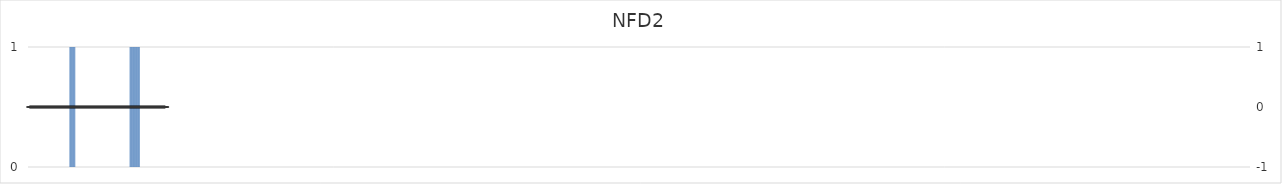
| Category | NFD2 |
|---|---|
| 1.0 | 0 |
| 2.0 | 0 |
| 3.0 | 0 |
| 4.0 | 0 |
| 5.0 | 0 |
| 6.0 | 0 |
| 7.0 | 0 |
| 8.0 | 0 |
| 9.0 | 0 |
| 10.0 | 0 |
| 11.0 | 0 |
| 12.0 | 0 |
| 13.0 | 0 |
| 14.0 | 0 |
| 15.0 | 0 |
| 16.0 | 0 |
| 17.0 | 0 |
| 18.0 | 0 |
| 19.0 | 0 |
| 20.0 | 0 |
| 21.0 | 0 |
| 22.0 | 0 |
| 23.0 | 0 |
| 24.0 | 0 |
| 25.0 | 0 |
| 26.0 | 0 |
| 27.0 | 0 |
| 28.0 | 0 |
| 29.0 | 0 |
| 30.0 | 0 |
| 31.0 | 0 |
| 32.0 | 0 |
| 33.0 | 0 |
| 34.0 | 0 |
| 35.0 | 0 |
| 36.0 | 0 |
| 37.0 | 0 |
| 38.0 | 0 |
| 39.0 | 0 |
| 40.0 | 0 |
| 41.0 | 0 |
| 42.0 | 0 |
| 43.0 | 0 |
| 44.0 | 0 |
| 45.0 | 0 |
| 46.0 | 0 |
| 47.0 | 0 |
| 48.0 | 0 |
| 49.0 | 0 |
| 50.0 | 0 |
| 51.0 | 0 |
| 52.0 | 0 |
| 53.0 | 0 |
| 54.0 | 0 |
| 55.0 | 0 |
| 56.0 | 0 |
| 57.0 | 0 |
| 58.0 | 0 |
| 59.0 | 1 |
| 60.0 | 1 |
| 61.0 | 1 |
| 62.0 | 1 |
| 63.0 | 1 |
| 64.0 | 1 |
| 65.0 | 1 |
| 66.0 | 1 |
| 67.0 | 0 |
| 68.0 | 0 |
| 69.0 | 0 |
| 70.0 | 0 |
| 71.0 | 0 |
| 72.0 | 0 |
| 73.0 | 0 |
| 74.0 | 0 |
| 75.0 | 0 |
| 76.0 | 0 |
| 77.0 | 0 |
| 78.0 | 0 |
| 79.0 | 0 |
| 80.0 | 0 |
| 81.0 | 0 |
| 82.0 | 0 |
| 83.0 | 0 |
| 84.0 | 0 |
| 85.0 | 0 |
| 86.0 | 0 |
| 87.0 | 0 |
| 88.0 | 0 |
| 89.0 | 0 |
| 90.0 | 0 |
| 91.0 | 0 |
| 92.0 | 0 |
| 93.0 | 0 |
| 94.0 | 0 |
| 95.0 | 0 |
| 96.0 | 0 |
| 97.0 | 0 |
| 98.0 | 0 |
| 99.0 | 0 |
| 100.0 | 0 |
| 101.0 | 0 |
| 102.0 | 0 |
| 103.0 | 0 |
| 104.0 | 0 |
| 105.0 | 0 |
| 106.0 | 0 |
| 107.0 | 0 |
| 108.0 | 0 |
| 109.0 | 0 |
| 110.0 | 0 |
| 111.0 | 0 |
| 112.0 | 0 |
| 113.0 | 0 |
| 114.0 | 0 |
| 115.0 | 0 |
| 116.0 | 0 |
| 117.0 | 0 |
| 118.0 | 0 |
| 119.0 | 0 |
| 120.0 | 0 |
| 121.0 | 0 |
| 122.0 | 0 |
| 123.0 | 0 |
| 124.0 | 0 |
| 125.0 | 0 |
| 126.0 | 0 |
| 127.0 | 0 |
| 128.0 | 0 |
| 129.0 | 0 |
| 130.0 | 0 |
| 131.0 | 0 |
| 132.0 | 0 |
| 133.0 | 0 |
| 134.0 | 0 |
| 135.0 | 0 |
| 136.0 | 0 |
| 137.0 | 0 |
| 138.0 | 0 |
| 139.0 | 0 |
| 140.0 | 0 |
| 141.0 | 0 |
| 142.0 | 0 |
| 143.0 | 1 |
| 144.0 | 1 |
| 145.0 | 1 |
| 146.0 | 1 |
| 147.0 | 1 |
| 148.0 | 1 |
| 149.0 | 1 |
| 150.0 | 1 |
| 151.0 | 1 |
| 152.0 | 1 |
| 153.0 | 1 |
| 154.0 | 1 |
| 155.0 | 1 |
| 156.0 | 1 |
| 157.0 | 0 |
| 158.0 | 0 |
| 159.0 | 0 |
| 160.0 | 0 |
| 161.0 | 0 |
| 162.0 | 0 |
| 163.0 | 0 |
| 164.0 | 0 |
| 165.0 | 0 |
| 166.0 | 0 |
| 167.0 | 0 |
| 168.0 | 0 |
| 169.0 | 0 |
| 170.0 | 0 |
| 171.0 | 0 |
| 172.0 | 0 |
| 173.0 | 0 |
| 174.0 | 0 |
| 175.0 | 0 |
| 176.0 | 0 |
| 177.0 | 0 |
| 178.0 | 0 |
| 179.0 | 0 |
| 180.0 | 0 |
| 181.0 | 0 |
| 182.0 | 0 |
| 183.0 | 0 |
| 184.0 | 0 |
| 185.0 | 0 |
| 186.0 | 0 |
| 187.0 | 0 |
| 188.0 | 0 |
| 189.0 | 0 |
| 190.0 | 0 |
| 191.0 | 0 |
| 192.0 | 0 |
| 193.0 | 0 |
| 194.0 | 0 |
| 195.0 | 0 |
| 196.0 | 0 |
| 197.0 | 0 |
| 198.0 | 0 |
| 199.0 | 0 |
| 200.0 | 0 |
| 201.0 | 0 |
| 202.0 | 0 |
| 203.0 | 0 |
| 204.0 | 0 |
| 205.0 | 0 |
| 206.0 | 0 |
| 207.0 | 0 |
| 208.0 | 0 |
| 209.0 | 0 |
| 210.0 | 0 |
| 211.0 | 0 |
| 212.0 | 0 |
| 213.0 | 0 |
| 214.0 | 0 |
| 215.0 | 0 |
| 216.0 | 0 |
| 217.0 | 0 |
| 218.0 | 0 |
| 219.0 | 0 |
| 220.0 | 0 |
| 221.0 | 0 |
| 222.0 | 0 |
| 223.0 | 0 |
| 224.0 | 0 |
| 225.0 | 0 |
| 226.0 | 0 |
| 227.0 | 0 |
| 228.0 | 0 |
| 229.0 | 0 |
| 230.0 | 0 |
| 231.0 | 0 |
| 232.0 | 0 |
| 233.0 | 0 |
| 234.0 | 0 |
| 235.0 | 0 |
| 236.0 | 0 |
| 237.0 | 0 |
| 238.0 | 0 |
| 239.0 | 0 |
| 240.0 | 0 |
| 241.0 | 0 |
| 242.0 | 0 |
| 243.0 | 0 |
| 244.0 | 0 |
| 245.0 | 0 |
| 246.0 | 0 |
| 247.0 | 0 |
| 248.0 | 0 |
| 249.0 | 0 |
| 250.0 | 0 |
| 251.0 | 0 |
| 252.0 | 0 |
| 253.0 | 0 |
| 254.0 | 0 |
| 255.0 | 0 |
| 256.0 | 0 |
| 257.0 | 0 |
| 258.0 | 0 |
| 259.0 | 0 |
| 260.0 | 0 |
| 261.0 | 0 |
| 262.0 | 0 |
| 263.0 | 0 |
| 264.0 | 0 |
| 265.0 | 0 |
| 266.0 | 0 |
| 267.0 | 0 |
| 268.0 | 0 |
| 269.0 | 0 |
| 270.0 | 0 |
| 271.0 | 0 |
| 272.0 | 0 |
| 273.0 | 0 |
| 274.0 | 0 |
| 275.0 | 0 |
| 276.0 | 0 |
| 277.0 | 0 |
| 278.0 | 0 |
| 279.0 | 0 |
| 280.0 | 0 |
| 281.0 | 0 |
| 282.0 | 0 |
| 283.0 | 0 |
| 284.0 | 0 |
| 285.0 | 0 |
| 286.0 | 0 |
| 287.0 | 0 |
| 288.0 | 0 |
| 289.0 | 0 |
| 290.0 | 0 |
| 291.0 | 0 |
| 292.0 | 0 |
| 293.0 | 0 |
| 294.0 | 0 |
| 295.0 | 0 |
| 296.0 | 0 |
| 297.0 | 0 |
| 298.0 | 0 |
| 299.0 | 0 |
| 300.0 | 0 |
| 301.0 | 0 |
| 302.0 | 0 |
| 303.0 | 0 |
| 304.0 | 0 |
| 305.0 | 0 |
| 306.0 | 0 |
| 307.0 | 0 |
| 308.0 | 0 |
| 309.0 | 0 |
| 310.0 | 0 |
| 311.0 | 0 |
| 312.0 | 0 |
| 313.0 | 0 |
| 314.0 | 0 |
| 315.0 | 0 |
| 316.0 | 0 |
| 317.0 | 0 |
| 318.0 | 0 |
| 319.0 | 0 |
| 320.0 | 0 |
| 321.0 | 0 |
| 322.0 | 0 |
| 323.0 | 0 |
| 324.0 | 0 |
| 325.0 | 0 |
| 326.0 | 0 |
| 327.0 | 0 |
| 328.0 | 0 |
| 329.0 | 0 |
| 330.0 | 0 |
| 331.0 | 0 |
| 332.0 | 0 |
| 333.0 | 0 |
| 334.0 | 0 |
| 335.0 | 0 |
| 336.0 | 0 |
| 337.0 | 0 |
| 338.0 | 0 |
| 339.0 | 0 |
| 340.0 | 0 |
| 341.0 | 0 |
| 342.0 | 0 |
| 343.0 | 0 |
| 344.0 | 0 |
| 345.0 | 0 |
| 346.0 | 0 |
| 347.0 | 0 |
| 348.0 | 0 |
| 349.0 | 0 |
| 350.0 | 0 |
| 351.0 | 0 |
| 352.0 | 0 |
| 353.0 | 0 |
| 354.0 | 0 |
| 355.0 | 0 |
| 356.0 | 0 |
| 357.0 | 0 |
| 358.0 | 0 |
| 359.0 | 0 |
| 360.0 | 0 |
| 361.0 | 0 |
| 362.0 | 0 |
| 363.0 | 0 |
| 364.0 | 0 |
| 365.0 | 0 |
| 366.0 | 0 |
| 367.0 | 0 |
| 368.0 | 0 |
| 369.0 | 0 |
| 370.0 | 0 |
| 371.0 | 0 |
| 372.0 | 0 |
| 373.0 | 0 |
| 374.0 | 0 |
| 375.0 | 0 |
| 376.0 | 0 |
| 377.0 | 0 |
| 378.0 | 0 |
| 379.0 | 0 |
| 380.0 | 0 |
| 381.0 | 0 |
| 382.0 | 0 |
| 383.0 | 0 |
| 384.0 | 0 |
| 385.0 | 0 |
| 386.0 | 0 |
| 387.0 | 0 |
| 388.0 | 0 |
| 389.0 | 0 |
| 390.0 | 0 |
| 391.0 | 0 |
| 392.0 | 0 |
| 393.0 | 0 |
| 394.0 | 0 |
| 395.0 | 0 |
| 396.0 | 0 |
| 397.0 | 0 |
| 398.0 | 0 |
| 399.0 | 0 |
| 400.0 | 0 |
| 401.0 | 0 |
| 402.0 | 0 |
| 403.0 | 0 |
| 404.0 | 0 |
| 405.0 | 0 |
| 406.0 | 0 |
| 407.0 | 0 |
| 408.0 | 0 |
| 409.0 | 0 |
| 410.0 | 0 |
| 411.0 | 0 |
| 412.0 | 0 |
| 413.0 | 0 |
| 414.0 | 0 |
| 415.0 | 0 |
| 416.0 | 0 |
| 417.0 | 0 |
| 418.0 | 0 |
| 419.0 | 0 |
| 420.0 | 0 |
| 421.0 | 0 |
| 422.0 | 0 |
| 423.0 | 0 |
| 424.0 | 0 |
| 425.0 | 0 |
| 426.0 | 0 |
| 427.0 | 0 |
| 428.0 | 0 |
| 429.0 | 0 |
| 430.0 | 0 |
| 431.0 | 0 |
| 432.0 | 0 |
| 433.0 | 0 |
| 434.0 | 0 |
| 435.0 | 0 |
| 436.0 | 0 |
| 437.0 | 0 |
| 438.0 | 0 |
| 439.0 | 0 |
| 440.0 | 0 |
| 441.0 | 0 |
| 442.0 | 0 |
| 443.0 | 0 |
| 444.0 | 0 |
| 445.0 | 0 |
| 446.0 | 0 |
| 447.0 | 0 |
| 448.0 | 0 |
| 449.0 | 0 |
| 450.0 | 0 |
| 451.0 | 0 |
| 452.0 | 0 |
| 453.0 | 0 |
| 454.0 | 0 |
| 455.0 | 0 |
| 456.0 | 0 |
| 457.0 | 0 |
| 458.0 | 0 |
| 459.0 | 0 |
| 460.0 | 0 |
| 461.0 | 0 |
| 462.0 | 0 |
| 463.0 | 0 |
| 464.0 | 0 |
| 465.0 | 0 |
| 466.0 | 0 |
| 467.0 | 0 |
| 468.0 | 0 |
| 469.0 | 0 |
| 470.0 | 0 |
| 471.0 | 0 |
| 472.0 | 0 |
| 473.0 | 0 |
| 474.0 | 0 |
| 475.0 | 0 |
| 476.0 | 0 |
| 477.0 | 0 |
| 478.0 | 0 |
| 479.0 | 0 |
| 480.0 | 0 |
| 481.0 | 0 |
| 482.0 | 0 |
| 483.0 | 0 |
| 484.0 | 0 |
| 485.0 | 0 |
| 486.0 | 0 |
| 487.0 | 0 |
| 488.0 | 0 |
| 489.0 | 0 |
| 490.0 | 0 |
| 491.0 | 0 |
| 492.0 | 0 |
| 493.0 | 0 |
| 494.0 | 0 |
| 495.0 | 0 |
| 496.0 | 0 |
| 497.0 | 0 |
| 498.0 | 0 |
| 499.0 | 0 |
| 500.0 | 0 |
| 501.0 | 0 |
| 502.0 | 0 |
| 503.0 | 0 |
| 504.0 | 0 |
| 505.0 | 0 |
| 506.0 | 0 |
| 507.0 | 0 |
| 508.0 | 0 |
| 509.0 | 0 |
| 510.0 | 0 |
| 511.0 | 0 |
| 512.0 | 0 |
| 513.0 | 0 |
| 514.0 | 0 |
| 515.0 | 0 |
| 516.0 | 0 |
| 517.0 | 0 |
| 518.0 | 0 |
| 519.0 | 0 |
| 520.0 | 0 |
| 521.0 | 0 |
| 522.0 | 0 |
| 523.0 | 0 |
| 524.0 | 0 |
| 525.0 | 0 |
| 526.0 | 0 |
| 527.0 | 0 |
| 528.0 | 0 |
| 529.0 | 0 |
| 530.0 | 0 |
| 531.0 | 0 |
| 532.0 | 0 |
| 533.0 | 0 |
| 534.0 | 0 |
| 535.0 | 0 |
| 536.0 | 0 |
| 537.0 | 0 |
| 538.0 | 0 |
| 539.0 | 0 |
| 540.0 | 0 |
| 541.0 | 0 |
| 542.0 | 0 |
| 543.0 | 0 |
| 544.0 | 0 |
| 545.0 | 0 |
| 546.0 | 0 |
| 547.0 | 0 |
| 548.0 | 0 |
| 549.0 | 0 |
| 550.0 | 0 |
| 551.0 | 0 |
| 552.0 | 0 |
| 553.0 | 0 |
| 554.0 | 0 |
| 555.0 | 0 |
| 556.0 | 0 |
| 557.0 | 0 |
| 558.0 | 0 |
| 559.0 | 0 |
| 560.0 | 0 |
| 561.0 | 0 |
| 562.0 | 0 |
| 563.0 | 0 |
| 564.0 | 0 |
| 565.0 | 0 |
| 566.0 | 0 |
| 567.0 | 0 |
| 568.0 | 0 |
| 569.0 | 0 |
| 570.0 | 0 |
| 571.0 | 0 |
| 572.0 | 0 |
| 573.0 | 0 |
| 574.0 | 0 |
| 575.0 | 0 |
| 576.0 | 0 |
| 577.0 | 0 |
| 578.0 | 0 |
| 579.0 | 0 |
| 580.0 | 0 |
| 581.0 | 0 |
| 582.0 | 0 |
| 583.0 | 0 |
| 584.0 | 0 |
| 585.0 | 0 |
| 586.0 | 0 |
| 587.0 | 0 |
| 588.0 | 0 |
| 589.0 | 0 |
| 590.0 | 0 |
| 591.0 | 0 |
| 592.0 | 0 |
| 593.0 | 0 |
| 594.0 | 0 |
| 595.0 | 0 |
| 596.0 | 0 |
| 597.0 | 0 |
| 598.0 | 0 |
| 599.0 | 0 |
| 600.0 | 0 |
| 601.0 | 0 |
| 602.0 | 0 |
| 603.0 | 0 |
| 604.0 | 0 |
| 605.0 | 0 |
| 606.0 | 0 |
| 607.0 | 0 |
| 608.0 | 0 |
| 609.0 | 0 |
| 610.0 | 0 |
| 611.0 | 0 |
| 612.0 | 0 |
| 613.0 | 0 |
| 614.0 | 0 |
| 615.0 | 0 |
| 616.0 | 0 |
| 617.0 | 0 |
| 618.0 | 0 |
| 619.0 | 0 |
| 620.0 | 0 |
| 621.0 | 0 |
| 622.0 | 0 |
| 623.0 | 0 |
| 624.0 | 0 |
| 625.0 | 0 |
| 626.0 | 0 |
| 627.0 | 0 |
| 628.0 | 0 |
| 629.0 | 0 |
| 630.0 | 0 |
| 631.0 | 0 |
| 632.0 | 0 |
| 633.0 | 0 |
| 634.0 | 0 |
| 635.0 | 0 |
| 636.0 | 0 |
| 637.0 | 0 |
| 638.0 | 0 |
| 639.0 | 0 |
| 640.0 | 0 |
| 641.0 | 0 |
| 642.0 | 0 |
| 643.0 | 0 |
| 644.0 | 0 |
| 645.0 | 0 |
| 646.0 | 0 |
| 647.0 | 0 |
| 648.0 | 0 |
| 649.0 | 0 |
| 650.0 | 0 |
| 651.0 | 0 |
| 652.0 | 0 |
| 653.0 | 0 |
| 654.0 | 0 |
| 655.0 | 0 |
| 656.0 | 0 |
| 657.0 | 0 |
| 658.0 | 0 |
| 659.0 | 0 |
| 660.0 | 0 |
| 661.0 | 0 |
| 662.0 | 0 |
| 663.0 | 0 |
| 664.0 | 0 |
| 665.0 | 0 |
| 666.0 | 0 |
| 667.0 | 0 |
| 668.0 | 0 |
| 669.0 | 0 |
| 670.0 | 0 |
| 671.0 | 0 |
| 672.0 | 0 |
| 673.0 | 0 |
| 674.0 | 0 |
| 675.0 | 0 |
| 676.0 | 0 |
| 677.0 | 0 |
| 678.0 | 0 |
| 679.0 | 0 |
| 680.0 | 0 |
| 681.0 | 0 |
| 682.0 | 0 |
| 683.0 | 0 |
| 684.0 | 0 |
| 685.0 | 0 |
| 686.0 | 0 |
| 687.0 | 0 |
| 688.0 | 0 |
| 689.0 | 0 |
| 690.0 | 0 |
| 691.0 | 0 |
| 692.0 | 0 |
| 693.0 | 0 |
| 694.0 | 0 |
| 695.0 | 0 |
| 696.0 | 0 |
| 697.0 | 0 |
| 698.0 | 0 |
| 699.0 | 0 |
| 700.0 | 0 |
| 701.0 | 0 |
| 702.0 | 0 |
| 703.0 | 0 |
| 704.0 | 0 |
| 705.0 | 0 |
| 706.0 | 0 |
| 707.0 | 0 |
| 708.0 | 0 |
| 709.0 | 0 |
| 710.0 | 0 |
| 711.0 | 0 |
| 712.0 | 0 |
| 713.0 | 0 |
| 714.0 | 0 |
| 715.0 | 0 |
| 716.0 | 0 |
| 717.0 | 0 |
| 718.0 | 0 |
| 719.0 | 0 |
| 720.0 | 0 |
| 721.0 | 0 |
| 722.0 | 0 |
| 723.0 | 0 |
| 724.0 | 0 |
| 725.0 | 0 |
| 726.0 | 0 |
| 727.0 | 0 |
| 728.0 | 0 |
| 729.0 | 0 |
| 730.0 | 0 |
| 731.0 | 0 |
| 732.0 | 0 |
| 733.0 | 0 |
| 734.0 | 0 |
| 735.0 | 0 |
| 736.0 | 0 |
| 737.0 | 0 |
| 738.0 | 0 |
| 739.0 | 0 |
| 740.0 | 0 |
| 741.0 | 0 |
| 742.0 | 0 |
| 743.0 | 0 |
| 744.0 | 0 |
| 745.0 | 0 |
| 746.0 | 0 |
| 747.0 | 0 |
| 748.0 | 0 |
| 749.0 | 0 |
| 750.0 | 0 |
| 751.0 | 0 |
| 752.0 | 0 |
| 753.0 | 0 |
| 754.0 | 0 |
| 755.0 | 0 |
| 756.0 | 0 |
| 757.0 | 0 |
| 758.0 | 0 |
| 759.0 | 0 |
| 760.0 | 0 |
| 761.0 | 0 |
| 762.0 | 0 |
| 763.0 | 0 |
| 764.0 | 0 |
| 765.0 | 0 |
| 766.0 | 0 |
| 767.0 | 0 |
| 768.0 | 0 |
| 769.0 | 0 |
| 770.0 | 0 |
| 771.0 | 0 |
| 772.0 | 0 |
| 773.0 | 0 |
| 774.0 | 0 |
| 775.0 | 0 |
| 776.0 | 0 |
| 777.0 | 0 |
| 778.0 | 0 |
| 779.0 | 0 |
| 780.0 | 0 |
| 781.0 | 0 |
| 782.0 | 0 |
| 783.0 | 0 |
| 784.0 | 0 |
| 785.0 | 0 |
| 786.0 | 0 |
| 787.0 | 0 |
| 788.0 | 0 |
| 789.0 | 0 |
| 790.0 | 0 |
| 791.0 | 0 |
| 792.0 | 0 |
| 793.0 | 0 |
| 794.0 | 0 |
| 795.0 | 0 |
| 796.0 | 0 |
| 797.0 | 0 |
| 798.0 | 0 |
| 799.0 | 0 |
| 800.0 | 0 |
| 801.0 | 0 |
| 802.0 | 0 |
| 803.0 | 0 |
| 804.0 | 0 |
| 805.0 | 0 |
| 806.0 | 0 |
| 807.0 | 0 |
| 808.0 | 0 |
| 809.0 | 0 |
| 810.0 | 0 |
| 811.0 | 0 |
| 812.0 | 0 |
| 813.0 | 0 |
| 814.0 | 0 |
| 815.0 | 0 |
| 816.0 | 0 |
| 817.0 | 0 |
| 818.0 | 0 |
| 819.0 | 0 |
| 820.0 | 0 |
| 821.0 | 0 |
| 822.0 | 0 |
| 823.0 | 0 |
| 824.0 | 0 |
| 825.0 | 0 |
| 826.0 | 0 |
| 827.0 | 0 |
| 828.0 | 0 |
| 829.0 | 0 |
| 830.0 | 0 |
| 831.0 | 0 |
| 832.0 | 0 |
| 833.0 | 0 |
| 834.0 | 0 |
| 835.0 | 0 |
| 836.0 | 0 |
| 837.0 | 0 |
| 838.0 | 0 |
| 839.0 | 0 |
| 840.0 | 0 |
| 841.0 | 0 |
| 842.0 | 0 |
| 843.0 | 0 |
| 844.0 | 0 |
| 845.0 | 0 |
| 846.0 | 0 |
| 847.0 | 0 |
| 848.0 | 0 |
| 849.0 | 0 |
| 850.0 | 0 |
| 851.0 | 0 |
| 852.0 | 0 |
| 853.0 | 0 |
| 854.0 | 0 |
| 855.0 | 0 |
| 856.0 | 0 |
| 857.0 | 0 |
| 858.0 | 0 |
| 859.0 | 0 |
| 860.0 | 0 |
| 861.0 | 0 |
| 862.0 | 0 |
| 863.0 | 0 |
| 864.0 | 0 |
| 865.0 | 0 |
| 866.0 | 0 |
| 867.0 | 0 |
| 868.0 | 0 |
| 869.0 | 0 |
| 870.0 | 0 |
| 871.0 | 0 |
| 872.0 | 0 |
| 873.0 | 0 |
| 874.0 | 0 |
| 875.0 | 0 |
| 876.0 | 0 |
| 877.0 | 0 |
| 878.0 | 0 |
| 879.0 | 0 |
| 880.0 | 0 |
| 881.0 | 0 |
| 882.0 | 0 |
| 883.0 | 0 |
| 884.0 | 0 |
| 885.0 | 0 |
| 886.0 | 0 |
| 887.0 | 0 |
| 888.0 | 0 |
| 889.0 | 0 |
| 890.0 | 0 |
| 891.0 | 0 |
| 892.0 | 0 |
| 893.0 | 0 |
| 894.0 | 0 |
| 895.0 | 0 |
| 896.0 | 0 |
| 897.0 | 0 |
| 898.0 | 0 |
| 899.0 | 0 |
| 900.0 | 0 |
| 901.0 | 0 |
| 902.0 | 0 |
| 903.0 | 0 |
| 904.0 | 0 |
| 905.0 | 0 |
| 906.0 | 0 |
| 907.0 | 0 |
| 908.0 | 0 |
| 909.0 | 0 |
| 910.0 | 0 |
| 911.0 | 0 |
| 912.0 | 0 |
| 913.0 | 0 |
| 914.0 | 0 |
| 915.0 | 0 |
| 916.0 | 0 |
| 917.0 | 0 |
| 918.0 | 0 |
| 919.0 | 0 |
| 920.0 | 0 |
| 921.0 | 0 |
| 922.0 | 0 |
| 923.0 | 0 |
| 924.0 | 0 |
| 925.0 | 0 |
| 926.0 | 0 |
| 927.0 | 0 |
| 928.0 | 0 |
| 929.0 | 0 |
| 930.0 | 0 |
| 931.0 | 0 |
| 932.0 | 0 |
| 933.0 | 0 |
| 934.0 | 0 |
| 935.0 | 0 |
| 936.0 | 0 |
| 937.0 | 0 |
| 938.0 | 0 |
| 939.0 | 0 |
| 940.0 | 0 |
| 941.0 | 0 |
| 942.0 | 0 |
| 943.0 | 0 |
| 944.0 | 0 |
| 945.0 | 0 |
| 946.0 | 0 |
| 947.0 | 0 |
| 948.0 | 0 |
| 949.0 | 0 |
| 950.0 | 0 |
| 951.0 | 0 |
| 952.0 | 0 |
| 953.0 | 0 |
| 954.0 | 0 |
| 955.0 | 0 |
| 956.0 | 0 |
| 957.0 | 0 |
| 958.0 | 0 |
| 959.0 | 0 |
| 960.0 | 0 |
| 961.0 | 0 |
| 962.0 | 0 |
| 963.0 | 0 |
| 964.0 | 0 |
| 965.0 | 0 |
| 966.0 | 0 |
| 967.0 | 0 |
| 968.0 | 0 |
| 969.0 | 0 |
| 970.0 | 0 |
| 971.0 | 0 |
| 972.0 | 0 |
| 973.0 | 0 |
| 974.0 | 0 |
| 975.0 | 0 |
| 976.0 | 0 |
| 977.0 | 0 |
| 978.0 | 0 |
| 979.0 | 0 |
| 980.0 | 0 |
| 981.0 | 0 |
| 982.0 | 0 |
| 983.0 | 0 |
| 984.0 | 0 |
| 985.0 | 0 |
| 986.0 | 0 |
| 987.0 | 0 |
| 988.0 | 0 |
| 989.0 | 0 |
| 990.0 | 0 |
| 991.0 | 0 |
| 992.0 | 0 |
| 993.0 | 0 |
| 994.0 | 0 |
| 995.0 | 0 |
| 996.0 | 0 |
| 997.0 | 0 |
| 998.0 | 0 |
| 999.0 | 0 |
| 1000.0 | 0 |
| 1001.0 | 0 |
| 1002.0 | 0 |
| 1003.0 | 0 |
| 1004.0 | 0 |
| 1005.0 | 0 |
| 1006.0 | 0 |
| 1007.0 | 0 |
| 1008.0 | 0 |
| 1009.0 | 0 |
| 1010.0 | 0 |
| 1011.0 | 0 |
| 1012.0 | 0 |
| 1013.0 | 0 |
| 1014.0 | 0 |
| 1015.0 | 0 |
| 1016.0 | 0 |
| 1017.0 | 0 |
| 1018.0 | 0 |
| 1019.0 | 0 |
| 1020.0 | 0 |
| 1021.0 | 0 |
| 1022.0 | 0 |
| 1023.0 | 0 |
| 1024.0 | 0 |
| 1025.0 | 0 |
| 1026.0 | 0 |
| 1027.0 | 0 |
| 1028.0 | 0 |
| 1029.0 | 0 |
| 1030.0 | 0 |
| 1031.0 | 0 |
| 1032.0 | 0 |
| 1033.0 | 0 |
| 1034.0 | 0 |
| 1035.0 | 0 |
| 1036.0 | 0 |
| 1037.0 | 0 |
| 1038.0 | 0 |
| 1039.0 | 0 |
| 1040.0 | 0 |
| 1041.0 | 0 |
| 1042.0 | 0 |
| 1043.0 | 0 |
| 1044.0 | 0 |
| 1045.0 | 0 |
| 1046.0 | 0 |
| 1047.0 | 0 |
| 1048.0 | 0 |
| 1049.0 | 0 |
| 1050.0 | 0 |
| 1051.0 | 0 |
| 1052.0 | 0 |
| 1053.0 | 0 |
| 1054.0 | 0 |
| 1055.0 | 0 |
| 1056.0 | 0 |
| 1057.0 | 0 |
| 1058.0 | 0 |
| 1059.0 | 0 |
| 1060.0 | 0 |
| 1061.0 | 0 |
| 1062.0 | 0 |
| 1063.0 | 0 |
| 1064.0 | 0 |
| 1065.0 | 0 |
| 1066.0 | 0 |
| 1067.0 | 0 |
| 1068.0 | 0 |
| 1069.0 | 0 |
| 1070.0 | 0 |
| 1071.0 | 0 |
| 1072.0 | 0 |
| 1073.0 | 0 |
| 1074.0 | 0 |
| 1075.0 | 0 |
| 1076.0 | 0 |
| 1077.0 | 0 |
| 1078.0 | 0 |
| 1079.0 | 0 |
| 1080.0 | 0 |
| 1081.0 | 0 |
| 1082.0 | 0 |
| 1083.0 | 0 |
| 1084.0 | 0 |
| 1085.0 | 0 |
| 1086.0 | 0 |
| 1087.0 | 0 |
| 1088.0 | 0 |
| 1089.0 | 0 |
| 1090.0 | 0 |
| 1091.0 | 0 |
| 1092.0 | 0 |
| 1093.0 | 0 |
| 1094.0 | 0 |
| 1095.0 | 0 |
| 1096.0 | 0 |
| 1097.0 | 0 |
| 1098.0 | 0 |
| 1099.0 | 0 |
| 1100.0 | 0 |
| 1101.0 | 0 |
| 1102.0 | 0 |
| 1103.0 | 0 |
| 1104.0 | 0 |
| 1105.0 | 0 |
| 1106.0 | 0 |
| 1107.0 | 0 |
| 1108.0 | 0 |
| 1109.0 | 0 |
| 1110.0 | 0 |
| 1111.0 | 0 |
| 1112.0 | 0 |
| 1113.0 | 0 |
| 1114.0 | 0 |
| 1115.0 | 0 |
| 1116.0 | 0 |
| 1117.0 | 0 |
| 1118.0 | 0 |
| 1119.0 | 0 |
| 1120.0 | 0 |
| 1121.0 | 0 |
| 1122.0 | 0 |
| 1123.0 | 0 |
| 1124.0 | 0 |
| 1125.0 | 0 |
| 1126.0 | 0 |
| 1127.0 | 0 |
| 1128.0 | 0 |
| 1129.0 | 0 |
| 1130.0 | 0 |
| 1131.0 | 0 |
| 1132.0 | 0 |
| 1133.0 | 0 |
| 1134.0 | 0 |
| 1135.0 | 0 |
| 1136.0 | 0 |
| 1137.0 | 0 |
| 1138.0 | 0 |
| 1139.0 | 0 |
| 1140.0 | 0 |
| 1141.0 | 0 |
| 1142.0 | 0 |
| 1143.0 | 0 |
| 1144.0 | 0 |
| 1145.0 | 0 |
| 1146.0 | 0 |
| 1147.0 | 0 |
| 1148.0 | 0 |
| 1149.0 | 0 |
| 1150.0 | 0 |
| 1151.0 | 0 |
| 1152.0 | 0 |
| 1153.0 | 0 |
| 1154.0 | 0 |
| 1155.0 | 0 |
| 1156.0 | 0 |
| 1157.0 | 0 |
| 1158.0 | 0 |
| 1159.0 | 0 |
| 1160.0 | 0 |
| 1161.0 | 0 |
| 1162.0 | 0 |
| 1163.0 | 0 |
| 1164.0 | 0 |
| 1165.0 | 0 |
| 1166.0 | 0 |
| 1167.0 | 0 |
| 1168.0 | 0 |
| 1169.0 | 0 |
| 1170.0 | 0 |
| 1171.0 | 0 |
| 1172.0 | 0 |
| 1173.0 | 0 |
| 1174.0 | 0 |
| 1175.0 | 0 |
| 1176.0 | 0 |
| 1177.0 | 0 |
| 1178.0 | 0 |
| 1179.0 | 0 |
| 1180.0 | 0 |
| 1181.0 | 0 |
| 1182.0 | 0 |
| 1183.0 | 0 |
| 1184.0 | 0 |
| 1185.0 | 0 |
| 1186.0 | 0 |
| 1187.0 | 0 |
| 1188.0 | 0 |
| 1189.0 | 0 |
| 1190.0 | 0 |
| 1191.0 | 0 |
| 1192.0 | 0 |
| 1193.0 | 0 |
| 1194.0 | 0 |
| 1195.0 | 0 |
| 1196.0 | 0 |
| 1197.0 | 0 |
| 1198.0 | 0 |
| 1199.0 | 0 |
| 1200.0 | 0 |
| 1201.0 | 0 |
| 1202.0 | 0 |
| 1203.0 | 0 |
| 1204.0 | 0 |
| 1205.0 | 0 |
| 1206.0 | 0 |
| 1207.0 | 0 |
| 1208.0 | 0 |
| 1209.0 | 0 |
| 1210.0 | 0 |
| 1211.0 | 0 |
| 1212.0 | 0 |
| 1213.0 | 0 |
| 1214.0 | 0 |
| 1215.0 | 0 |
| 1216.0 | 0 |
| 1217.0 | 0 |
| 1218.0 | 0 |
| 1219.0 | 0 |
| 1220.0 | 0 |
| 1221.0 | 0 |
| 1222.0 | 0 |
| 1223.0 | 0 |
| 1224.0 | 0 |
| 1225.0 | 0 |
| 1226.0 | 0 |
| 1227.0 | 0 |
| 1228.0 | 0 |
| 1229.0 | 0 |
| 1230.0 | 0 |
| 1231.0 | 0 |
| 1232.0 | 0 |
| 1233.0 | 0 |
| 1234.0 | 0 |
| 1235.0 | 0 |
| 1236.0 | 0 |
| 1237.0 | 0 |
| 1238.0 | 0 |
| 1239.0 | 0 |
| 1240.0 | 0 |
| 1241.0 | 0 |
| 1242.0 | 0 |
| 1243.0 | 0 |
| 1244.0 | 0 |
| 1245.0 | 0 |
| 1246.0 | 0 |
| 1247.0 | 0 |
| 1248.0 | 0 |
| 1249.0 | 0 |
| 1250.0 | 0 |
| 1251.0 | 0 |
| 1252.0 | 0 |
| 1253.0 | 0 |
| 1254.0 | 0 |
| 1255.0 | 0 |
| 1256.0 | 0 |
| 1257.0 | 0 |
| 1258.0 | 0 |
| 1259.0 | 0 |
| 1260.0 | 0 |
| 1261.0 | 0 |
| 1262.0 | 0 |
| 1263.0 | 0 |
| 1264.0 | 0 |
| 1265.0 | 0 |
| 1266.0 | 0 |
| 1267.0 | 0 |
| 1268.0 | 0 |
| 1269.0 | 0 |
| 1270.0 | 0 |
| 1271.0 | 0 |
| 1272.0 | 0 |
| 1273.0 | 0 |
| 1274.0 | 0 |
| 1275.0 | 0 |
| 1276.0 | 0 |
| 1277.0 | 0 |
| 1278.0 | 0 |
| 1279.0 | 0 |
| 1280.0 | 0 |
| 1281.0 | 0 |
| 1282.0 | 0 |
| 1283.0 | 0 |
| 1284.0 | 0 |
| 1285.0 | 0 |
| 1286.0 | 0 |
| 1287.0 | 0 |
| 1288.0 | 0 |
| 1289.0 | 0 |
| 1290.0 | 0 |
| 1291.0 | 0 |
| 1292.0 | 0 |
| 1293.0 | 0 |
| 1294.0 | 0 |
| 1295.0 | 0 |
| 1296.0 | 0 |
| 1297.0 | 0 |
| 1298.0 | 0 |
| 1299.0 | 0 |
| 1300.0 | 0 |
| 1301.0 | 0 |
| 1302.0 | 0 |
| 1303.0 | 0 |
| 1304.0 | 0 |
| 1305.0 | 0 |
| 1306.0 | 0 |
| 1307.0 | 0 |
| 1308.0 | 0 |
| 1309.0 | 0 |
| 1310.0 | 0 |
| 1311.0 | 0 |
| 1312.0 | 0 |
| 1313.0 | 0 |
| 1314.0 | 0 |
| 1315.0 | 0 |
| 1316.0 | 0 |
| 1317.0 | 0 |
| 1318.0 | 0 |
| 1319.0 | 0 |
| 1320.0 | 0 |
| 1321.0 | 0 |
| 1322.0 | 0 |
| 1323.0 | 0 |
| 1324.0 | 0 |
| 1325.0 | 0 |
| 1326.0 | 0 |
| 1327.0 | 0 |
| 1328.0 | 0 |
| 1329.0 | 0 |
| 1330.0 | 0 |
| 1331.0 | 0 |
| 1332.0 | 0 |
| 1333.0 | 0 |
| 1334.0 | 0 |
| 1335.0 | 0 |
| 1336.0 | 0 |
| 1337.0 | 0 |
| 1338.0 | 0 |
| 1339.0 | 0 |
| 1340.0 | 0 |
| 1341.0 | 0 |
| 1342.0 | 0 |
| 1343.0 | 0 |
| 1344.0 | 0 |
| 1345.0 | 0 |
| 1346.0 | 0 |
| 1347.0 | 0 |
| 1348.0 | 0 |
| 1349.0 | 0 |
| 1350.0 | 0 |
| 1351.0 | 0 |
| 1352.0 | 0 |
| 1353.0 | 0 |
| 1354.0 | 0 |
| 1355.0 | 0 |
| 1356.0 | 0 |
| 1357.0 | 0 |
| 1358.0 | 0 |
| 1359.0 | 0 |
| 1360.0 | 0 |
| 1361.0 | 0 |
| 1362.0 | 0 |
| 1363.0 | 0 |
| 1364.0 | 0 |
| 1365.0 | 0 |
| 1366.0 | 0 |
| 1367.0 | 0 |
| 1368.0 | 0 |
| 1369.0 | 0 |
| 1370.0 | 0 |
| 1371.0 | 0 |
| 1372.0 | 0 |
| 1373.0 | 0 |
| 1374.0 | 0 |
| 1375.0 | 0 |
| 1376.0 | 0 |
| 1377.0 | 0 |
| 1378.0 | 0 |
| 1379.0 | 0 |
| 1380.0 | 0 |
| 1381.0 | 0 |
| 1382.0 | 0 |
| 1383.0 | 0 |
| 1384.0 | 0 |
| 1385.0 | 0 |
| 1386.0 | 0 |
| 1387.0 | 0 |
| 1388.0 | 0 |
| 1389.0 | 0 |
| 1390.0 | 0 |
| 1391.0 | 0 |
| 1392.0 | 0 |
| 1393.0 | 0 |
| 1394.0 | 0 |
| 1395.0 | 0 |
| 1396.0 | 0 |
| 1397.0 | 0 |
| 1398.0 | 0 |
| 1399.0 | 0 |
| 1400.0 | 0 |
| 1401.0 | 0 |
| 1402.0 | 0 |
| 1403.0 | 0 |
| 1404.0 | 0 |
| 1405.0 | 0 |
| 1406.0 | 0 |
| 1407.0 | 0 |
| 1408.0 | 0 |
| 1409.0 | 0 |
| 1410.0 | 0 |
| 1411.0 | 0 |
| 1412.0 | 0 |
| 1413.0 | 0 |
| 1414.0 | 0 |
| 1415.0 | 0 |
| 1416.0 | 0 |
| 1417.0 | 0 |
| 1418.0 | 0 |
| 1419.0 | 0 |
| 1420.0 | 0 |
| 1421.0 | 0 |
| 1422.0 | 0 |
| 1423.0 | 0 |
| 1424.0 | 0 |
| 1425.0 | 0 |
| 1426.0 | 0 |
| 1427.0 | 0 |
| 1428.0 | 0 |
| 1429.0 | 0 |
| 1430.0 | 0 |
| 1431.0 | 0 |
| 1432.0 | 0 |
| 1433.0 | 0 |
| 1434.0 | 0 |
| 1435.0 | 0 |
| 1436.0 | 0 |
| 1437.0 | 0 |
| 1438.0 | 0 |
| 1439.0 | 0 |
| 1440.0 | 0 |
| 1441.0 | 0 |
| 1442.0 | 0 |
| 1443.0 | 0 |
| 1444.0 | 0 |
| 1445.0 | 0 |
| 1446.0 | 0 |
| 1447.0 | 0 |
| 1448.0 | 0 |
| 1449.0 | 0 |
| 1450.0 | 0 |
| 1451.0 | 0 |
| 1452.0 | 0 |
| 1453.0 | 0 |
| 1454.0 | 0 |
| 1455.0 | 0 |
| 1456.0 | 0 |
| 1457.0 | 0 |
| 1458.0 | 0 |
| 1459.0 | 0 |
| 1460.0 | 0 |
| 1461.0 | 0 |
| 1462.0 | 0 |
| 1463.0 | 0 |
| 1464.0 | 0 |
| 1465.0 | 0 |
| 1466.0 | 0 |
| 1467.0 | 0 |
| 1468.0 | 0 |
| 1469.0 | 0 |
| 1470.0 | 0 |
| 1471.0 | 0 |
| 1472.0 | 0 |
| 1473.0 | 0 |
| 1474.0 | 0 |
| 1475.0 | 0 |
| 1476.0 | 0 |
| 1477.0 | 0 |
| 1478.0 | 0 |
| 1479.0 | 0 |
| 1480.0 | 0 |
| 1481.0 | 0 |
| 1482.0 | 0 |
| 1483.0 | 0 |
| 1484.0 | 0 |
| 1485.0 | 0 |
| 1486.0 | 0 |
| 1487.0 | 0 |
| 1488.0 | 0 |
| 1489.0 | 0 |
| 1490.0 | 0 |
| 1491.0 | 0 |
| 1492.0 | 0 |
| 1493.0 | 0 |
| 1494.0 | 0 |
| 1495.0 | 0 |
| 1496.0 | 0 |
| 1497.0 | 0 |
| 1498.0 | 0 |
| 1499.0 | 0 |
| 1500.0 | 0 |
| 1501.0 | 0 |
| 1502.0 | 0 |
| 1503.0 | 0 |
| 1504.0 | 0 |
| 1505.0 | 0 |
| 1506.0 | 0 |
| 1507.0 | 0 |
| 1508.0 | 0 |
| 1509.0 | 0 |
| 1510.0 | 0 |
| 1511.0 | 0 |
| 1512.0 | 0 |
| 1513.0 | 0 |
| 1514.0 | 0 |
| 1515.0 | 0 |
| 1516.0 | 0 |
| 1517.0 | 0 |
| 1518.0 | 0 |
| 1519.0 | 0 |
| 1520.0 | 0 |
| 1521.0 | 0 |
| 1522.0 | 0 |
| 1523.0 | 0 |
| 1524.0 | 0 |
| 1525.0 | 0 |
| 1526.0 | 0 |
| 1527.0 | 0 |
| 1528.0 | 0 |
| 1529.0 | 0 |
| 1530.0 | 0 |
| 1531.0 | 0 |
| 1532.0 | 0 |
| 1533.0 | 0 |
| 1534.0 | 0 |
| 1535.0 | 0 |
| 1536.0 | 0 |
| 1537.0 | 0 |
| 1538.0 | 0 |
| 1539.0 | 0 |
| 1540.0 | 0 |
| 1541.0 | 0 |
| 1542.0 | 0 |
| 1543.0 | 0 |
| 1544.0 | 0 |
| 1545.0 | 0 |
| 1546.0 | 0 |
| 1547.0 | 0 |
| 1548.0 | 0 |
| 1549.0 | 0 |
| 1550.0 | 0 |
| 1551.0 | 0 |
| 1552.0 | 0 |
| 1553.0 | 0 |
| 1554.0 | 0 |
| 1555.0 | 0 |
| 1556.0 | 0 |
| 1557.0 | 0 |
| 1558.0 | 0 |
| 1559.0 | 0 |
| 1560.0 | 0 |
| 1561.0 | 0 |
| 1562.0 | 0 |
| 1563.0 | 0 |
| 1564.0 | 0 |
| 1565.0 | 0 |
| 1566.0 | 0 |
| 1567.0 | 0 |
| 1568.0 | 0 |
| 1569.0 | 0 |
| 1570.0 | 0 |
| 1571.0 | 0 |
| 1572.0 | 0 |
| 1573.0 | 0 |
| 1574.0 | 0 |
| 1575.0 | 0 |
| 1576.0 | 0 |
| 1577.0 | 0 |
| 1578.0 | 0 |
| 1579.0 | 0 |
| 1580.0 | 0 |
| 1581.0 | 0 |
| 1582.0 | 0 |
| 1583.0 | 0 |
| 1584.0 | 0 |
| 1585.0 | 0 |
| 1586.0 | 0 |
| 1587.0 | 0 |
| 1588.0 | 0 |
| 1589.0 | 0 |
| 1590.0 | 0 |
| 1591.0 | 0 |
| 1592.0 | 0 |
| 1593.0 | 0 |
| 1594.0 | 0 |
| 1595.0 | 0 |
| 1596.0 | 0 |
| 1597.0 | 0 |
| 1598.0 | 0 |
| 1599.0 | 0 |
| 1600.0 | 0 |
| 1601.0 | 0 |
| 1602.0 | 0 |
| 1603.0 | 0 |
| 1604.0 | 0 |
| 1605.0 | 0 |
| 1606.0 | 0 |
| 1607.0 | 0 |
| 1608.0 | 0 |
| 1609.0 | 0 |
| 1610.0 | 0 |
| 1611.0 | 0 |
| 1612.0 | 0 |
| 1613.0 | 0 |
| 1614.0 | 0 |
| 1615.0 | 0 |
| 1616.0 | 0 |
| 1617.0 | 0 |
| 1618.0 | 0 |
| 1619.0 | 0 |
| 1620.0 | 0 |
| 1621.0 | 0 |
| 1622.0 | 0 |
| 1623.0 | 0 |
| 1624.0 | 0 |
| 1625.0 | 0 |
| 1626.0 | 0 |
| 1627.0 | 0 |
| 1628.0 | 0 |
| 1629.0 | 0 |
| 1630.0 | 0 |
| 1631.0 | 0 |
| 1632.0 | 0 |
| 1633.0 | 0 |
| 1634.0 | 0 |
| 1635.0 | 0 |
| 1636.0 | 0 |
| 1637.0 | 0 |
| 1638.0 | 0 |
| 1639.0 | 0 |
| 1640.0 | 0 |
| 1641.0 | 0 |
| 1642.0 | 0 |
| 1643.0 | 0 |
| 1644.0 | 0 |
| 1645.0 | 0 |
| 1646.0 | 0 |
| 1647.0 | 0 |
| 1648.0 | 0 |
| 1649.0 | 0 |
| 1650.0 | 0 |
| 1651.0 | 0 |
| 1652.0 | 0 |
| 1653.0 | 0 |
| 1654.0 | 0 |
| 1655.0 | 0 |
| 1656.0 | 0 |
| 1657.0 | 0 |
| 1658.0 | 0 |
| 1659.0 | 0 |
| 1660.0 | 0 |
| 1661.0 | 0 |
| 1662.0 | 0 |
| 1663.0 | 0 |
| 1664.0 | 0 |
| 1665.0 | 0 |
| 1666.0 | 0 |
| 1667.0 | 0 |
| 1668.0 | 0 |
| 1669.0 | 0 |
| 1670.0 | 0 |
| 1671.0 | 0 |
| 1672.0 | 0 |
| 1673.0 | 0 |
| 1674.0 | 0 |
| 1675.0 | 0 |
| 1676.0 | 0 |
| 1677.0 | 0 |
| 1678.0 | 0 |
| 1679.0 | 0 |
| 1680.0 | 0 |
| 1681.0 | 0 |
| 1682.0 | 0 |
| 1683.0 | 0 |
| 1684.0 | 0 |
| 1685.0 | 0 |
| 1686.0 | 0 |
| 1687.0 | 0 |
| 1688.0 | 0 |
| 1689.0 | 0 |
| 1690.0 | 0 |
| 1691.0 | 0 |
| 1692.0 | 0 |
| 1693.0 | 0 |
| 1694.0 | 0 |
| 1695.0 | 0 |
| 1696.0 | 0 |
| 1697.0 | 0 |
| 1698.0 | 0 |
| 1699.0 | 0 |
| 1700.0 | 0 |
| 1701.0 | 0 |
| 1702.0 | 0 |
| 1703.0 | 0 |
| 1704.0 | 0 |
| 1705.0 | 0 |
| 1706.0 | 0 |
| 1707.0 | 0 |